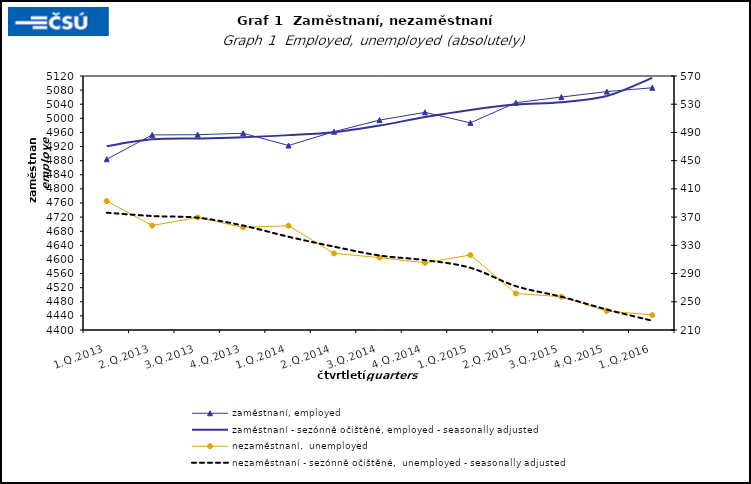
| Category | zaměstnaní, employed | zaměstnaní - sezónně očištěné, employed - seasonally adjusted |
|---|---|---|
| 1.Q.2013 | 4884.025 | 4921.298 |
| 2.Q.2013 | 4952.991 | 4940.38 |
| 3.Q.2013 | 4953.606 | 4943.118 |
| 4.Q.2013 | 4957.713 | 4946.225 |
| 1.Q.2014 | 4922.963 | 4952.405 |
| 2.Q.2014 | 4962.219 | 4960.65 |
| 3.Q.2014 | 4994.947 | 4979.618 |
| 4.Q.2014 | 5017.051 | 5003.629 |
| 1.Q.2015 | 4987.141 | 5023.827 |
| 2.Q.2015 | 5044.285 | 5038.984 |
| 3.Q.2015 | 5060.3 | 5045.647 |
| 4.Q.2015 | 5075.884 | 5063.085 |
| 1.Q.2016 | 5086.671 | 5114.698 |